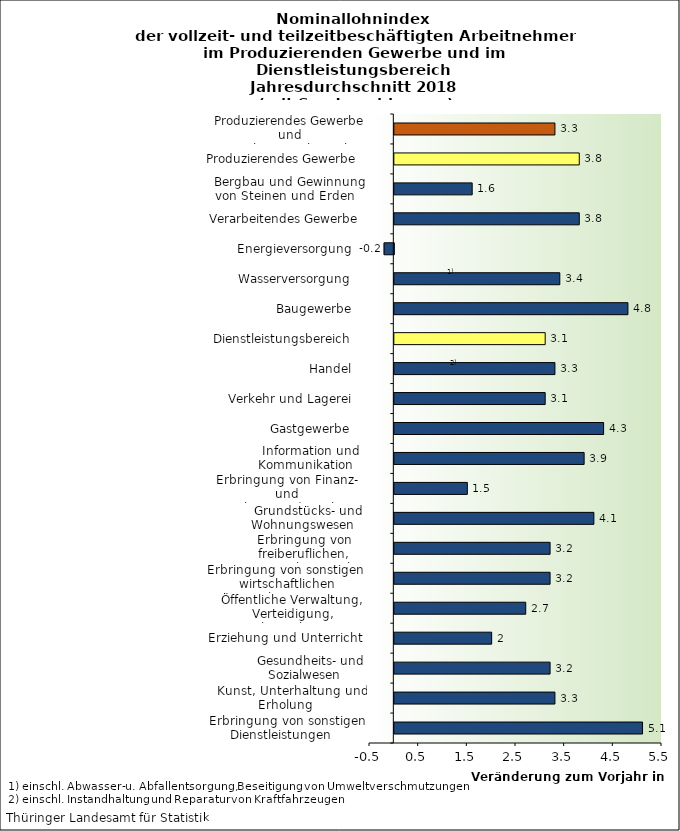
| Category | Series 0 |
|---|---|
| Erbringung von sonstigen Dienstleistungen    | 5.1 |
| Kunst, Unterhaltung und Erholung    | 3.3 |
| Gesundheits- und Sozialwesen    | 3.2 |
| Erziehung und Unterricht    | 2 |
| Öffentliche Verwaltung, Verteidigung, Sozialversicherung    | 2.7 |
| Erbringung von sonstigen  wirtschaftlichen Dienstleistungen    | 3.2 |
| Erbringung von freiberuflichen, wissensch. u. techn. Dienstleistungen    | 3.2 |
| Grundstücks- und Wohnungswesen    | 4.1 |
| Erbringung von Finanz- und Versicherungsdienstleistungen    | 1.5 |
| Information und Kommunikation    | 3.9 |
| Gastgewerbe    | 4.3 |
| Verkehr und Lagerei    | 3.1 |
| Handel    | 3.3 |
| Dienstleistungsbereich    | 3.1 |
| Baugewerbe    | 4.8 |
| Wasserversorgung    | 3.4 |
| Energieversorgung    | -0.2 |
| Verarbeitendes Gewerbe    | 3.8 |
| Bergbau und Gewinnung von Steinen und Erden    | 1.6 |
| Produzierendes Gewerbe    | 3.8 |
| Produzierendes Gewerbe und Dienstleistungsbereich    | 3.3 |